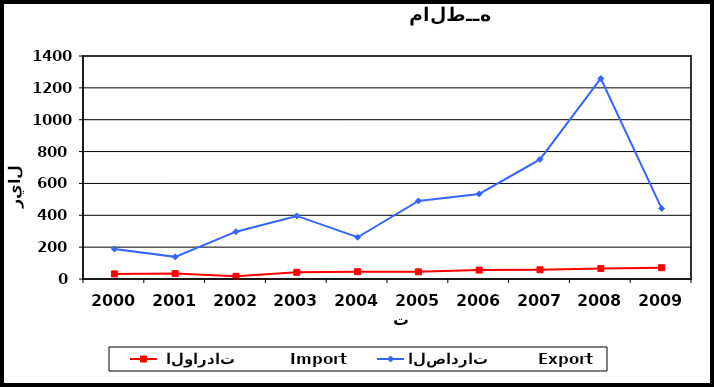
| Category |  الواردات           Import | الصادرات          Export |
|---|---|---|
| 2000.0 | 32 | 188 |
| 2001.0 | 34 | 139 |
| 2002.0 | 17 | 297 |
| 2003.0 | 42 | 396 |
| 2004.0 | 46 | 262 |
| 2005.0 | 45 | 490 |
| 2006.0 | 56 | 534 |
| 2007.0 | 58 | 751 |
| 2008.0 | 66 | 1259 |
| 2009.0 | 71 | 443 |